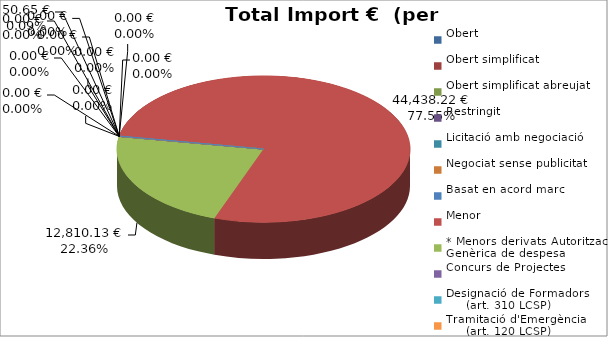
| Category | Total preu
(amb IVA) |
|---|---|
| Obert | 0 |
| Obert simplificat | 0 |
| Obert simplificat abreujat | 0 |
| Restringit | 0 |
| Licitació amb negociació | 0 |
| Negociat sense publicitat | 0 |
| Basat en acord marc | 50.65 |
| Menor | 44438.22 |
| * Menors derivats Autorització Genèrica de despesa | 12810.13 |
| Concurs de Projectes | 0 |
| Designació de Formadors
     (art. 310 LCSP) | 0 |
| Tramitació d'Emergència
     (art. 120 LCSP) | 0 |